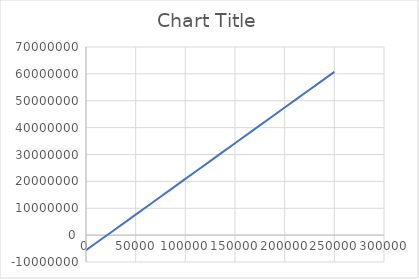
| Category | Series 0 |
|---|---|
| 0.0 | -5645440.394 |
| 25000.0 | 993943.582 |
| 50000.0 | 7633327.558 |
| 75000.0 | 14272711.534 |
| 100000.0 | 20912095.51 |
| 125000.0 | 27551479.486 |
| 150000.0 | 34190863.462 |
| 175000.0 | 40830247.438 |
| 200000.0 | 47469631.414 |
| 225000.0 | 54109015.39 |
| 250000.0 | 60748399.366 |